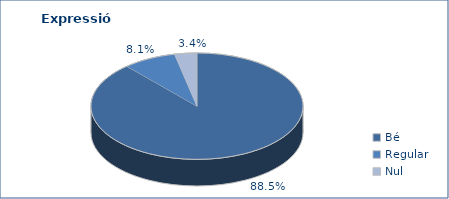
| Category | Series 0 |
|---|---|
| Bé | 5087 |
| Regular | 465 |
| Nul | 195 |